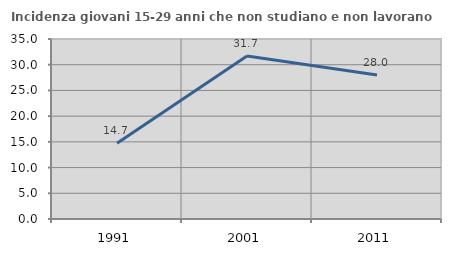
| Category | Incidenza giovani 15-29 anni che non studiano e non lavorano  |
|---|---|
| 1991.0 | 14.723 |
| 2001.0 | 31.674 |
| 2011.0 | 28.017 |